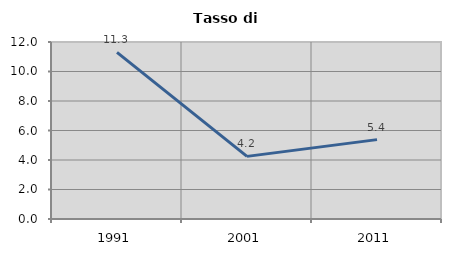
| Category | Tasso di disoccupazione   |
|---|---|
| 1991.0 | 11.293 |
| 2001.0 | 4.245 |
| 2011.0 | 5.382 |